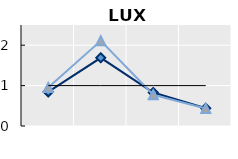
| Category | Foreign-born | Native-born | Series 1 |
|---|---|---|---|
| 15-24 | 0.845 | 0.955 | 1 |
| 25-54 | 1.688 | 2.108 | 1 |
| 55-64 | 0.827 | 0.772 | 1 |
| 65+ | 0.439 | 0.435 | 1 |